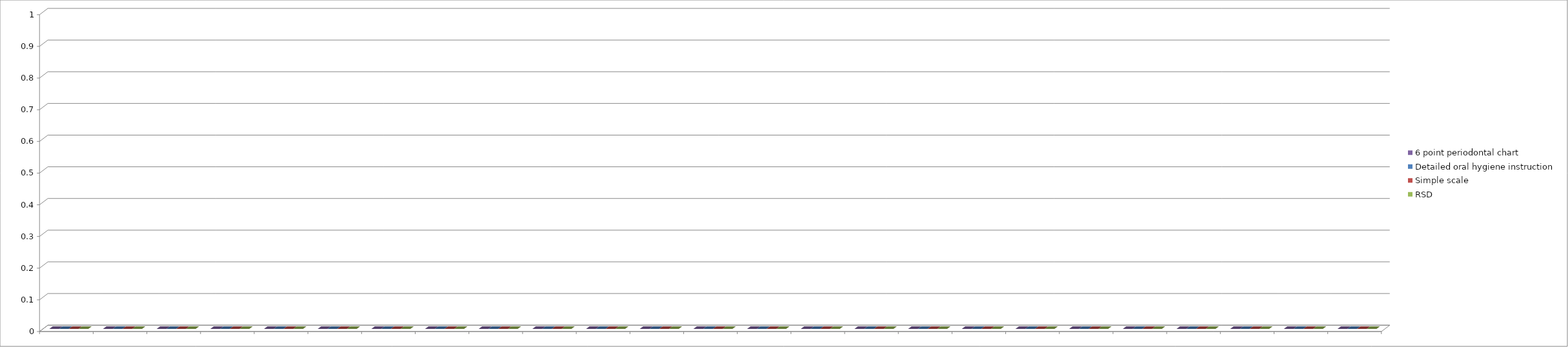
| Category | 6 point periodontal chart | Detailed oral hygiene instruction | Simple scale | RSD |
|---|---|---|---|---|
| 0 | 0 | 0 | 0 | 0 |
| 1 | 0 | 0 | 0 | 0 |
| 2 | 0 | 0 | 0 | 0 |
| 3 | 0 | 0 | 0 | 0 |
| 4 | 0 | 0 | 0 | 0 |
| 5 | 0 | 0 | 0 | 0 |
| 6 | 0 | 0 | 0 | 0 |
| 7 | 0 | 0 | 0 | 0 |
| 8 | 0 | 0 | 0 | 0 |
| 9 | 0 | 0 | 0 | 0 |
| 10 | 0 | 0 | 0 | 0 |
| 11 | 0 | 0 | 0 | 0 |
| 12 | 0 | 0 | 0 | 0 |
| 13 | 0 | 0 | 0 | 0 |
| 14 | 0 | 0 | 0 | 0 |
| 15 | 0 | 0 | 0 | 0 |
| 16 | 0 | 0 | 0 | 0 |
| 17 | 0 | 0 | 0 | 0 |
| 18 | 0 | 0 | 0 | 0 |
| 19 | 0 | 0 | 0 | 0 |
| 20 | 0 | 0 | 0 | 0 |
| 21 | 0 | 0 | 0 | 0 |
| 22 | 0 | 0 | 0 | 0 |
| 23 | 0 | 0 | 0 | 0 |
| 24 | 0 | 0 | 0 | 0 |